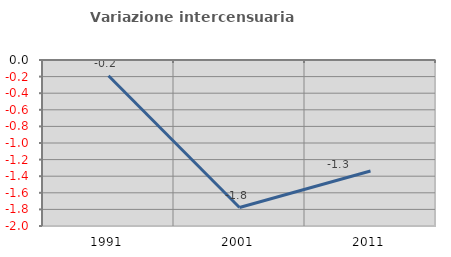
| Category | Variazione intercensuaria annua |
|---|---|
| 1991.0 | -0.19 |
| 2001.0 | -1.777 |
| 2011.0 | -1.338 |